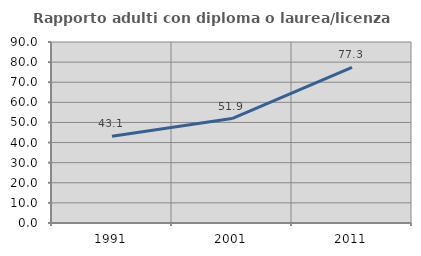
| Category | Rapporto adulti con diploma o laurea/licenza media  |
|---|---|
| 1991.0 | 43.119 |
| 2001.0 | 51.934 |
| 2011.0 | 77.34 |